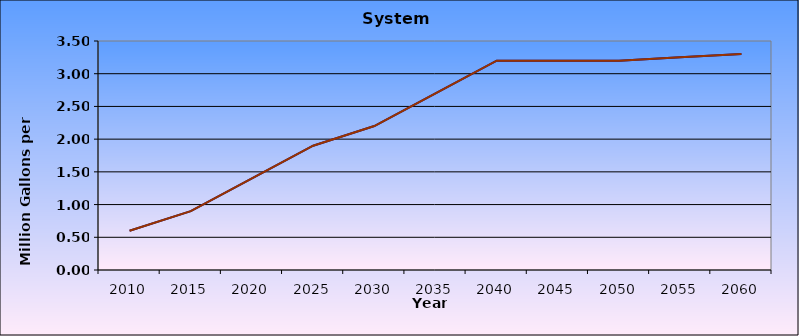
| Category | Series 0 | Series 1 |
|---|---|---|
| 2010.0 | 0.6 | 0.6 |
| 2015.0 | 0.9 | 0.9 |
| 2020.0 | 1.4 | 1.4 |
| 2025.0 | 1.9 | 1.9 |
| 2030.0 | 2.2 | 2.2 |
| 2035.0 | 2.7 | 2.7 |
| 2040.0 | 3.2 | 3.2 |
| 2045.0 | 3.2 | 3.2 |
| 2050.0 | 3.2 | 3.2 |
| 2055.0 | 3.25 | 3.25 |
| 2060.0 | 3.3 | 3.3 |